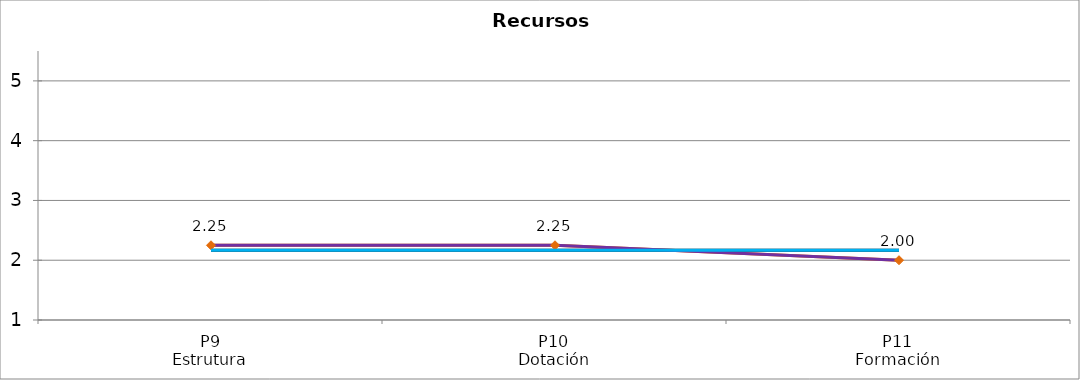
| Category | Valoración (1-5) | MEDIA |
|---|---|---|
| P9
Estrutura | 2.25 | 2.167 |
| P10
Dotación | 2.25 | 2.167 |
| P11
Formación | 2 | 2.167 |